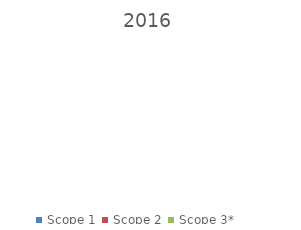
| Category | 2016 |
|---|---|
| Scope 1 | 0 |
| Scope 2 | 0 |
| Scope 3* | 0 |